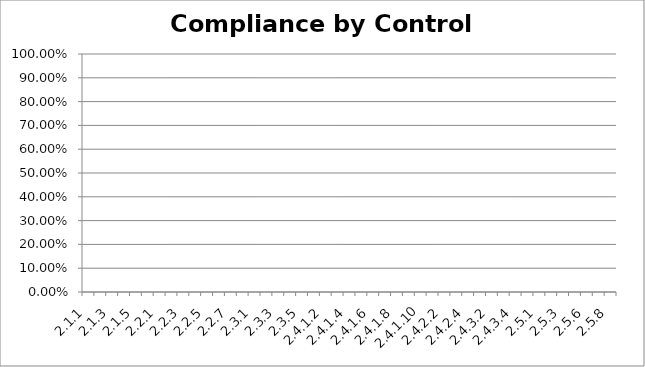
| Category | Compliance |
|---|---|
| 2.1.1 | 0 |
| 2.1.2 | 0 |
| 2.1.3 | 0 |
| 2.1.4 | 0 |
| 2.1.5 | 0 |
| 2.1.6 | 0 |
| 2.2.1 | 0 |
| 2.2.2 | 0 |
| 2.2.3 | 0 |
| 2.2.4 | 0 |
| 2.2.5 | 0 |
| 2.2.6 | 0 |
| 2.2.7 | 0 |
| 2.2.8 | 0 |
| 2.3.1 | 0 |
| 2.3.2 | 0 |
| 2.3.3 | 0 |
| 2.3.4 | 0 |
| 2.3.5 | 0 |
| 2.4.1.1 | 0 |
| 2.4.1.2 | 0 |
| 2.4.1.3 | 0 |
| 2.4.1.4 | 0 |
| 2.4.1.5 | 0 |
| 2.4.1.6 | 0 |
| 2.4.1.7 | 0 |
| 2.4.1.8 | 0 |
| 2.4.1.9 | 0 |
| 2.4.1.10 | 0 |
| 2.4.2.1 | 0 |
| 2.4.2.2 | 0 |
| 2.4.2.3 | 0 |
| 2.4.2.4 | 0 |
| 2.4.3.1 | 0 |
| 2.4.3.2 | 0 |
| 2.4.3.3 | 0 |
| 2.4.3.4 | 0 |
| 2.4.3.5 | 0 |
| 2.5.1 | 0 |
| 2.5.2 | 0 |
| 2.5.3 | 0 |
| 2.5.4 | 0 |
| 2.5.6 | 0 |
| 2.5.7 | 0 |
| 2.5.8 | 0 |